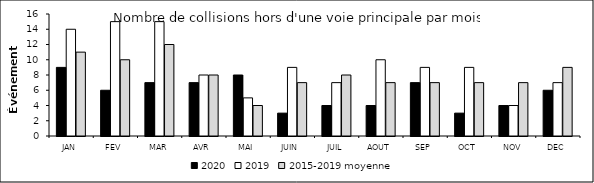
| Category | 2020 | 2019 | 2015-2019 moyenne |
|---|---|---|---|
| JAN | 9 | 14 | 11 |
| FEV | 6 | 15 | 10 |
| MAR | 7 | 15 | 12 |
| AVR | 7 | 8 | 8 |
| MAI | 8 | 5 | 4 |
| JUIN | 3 | 9 | 7 |
| JUIL | 4 | 7 | 8 |
| AOUT | 4 | 10 | 7 |
| SEP | 7 | 9 | 7 |
| OCT | 3 | 9 | 7 |
| NOV | 4 | 4 | 7 |
| DEC | 6 | 7 | 9 |